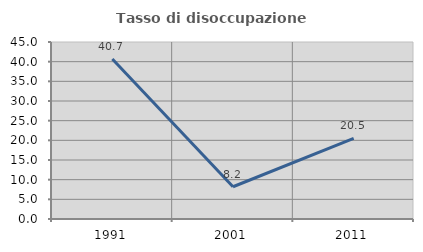
| Category | Tasso di disoccupazione giovanile  |
|---|---|
| 1991.0 | 40.659 |
| 2001.0 | 8.197 |
| 2011.0 | 20.513 |